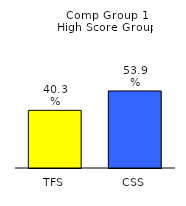
| Category | Series 0 |
|---|---|
| TFS | 0.403 |
| CSS | 0.539 |